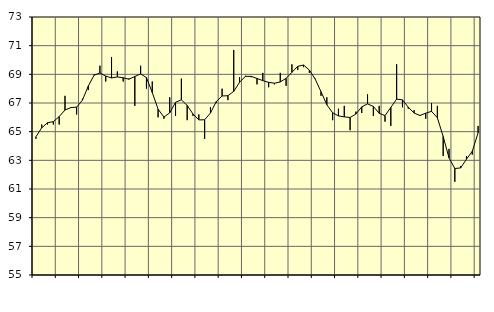
| Category | Piggar | Series 1 |
|---|---|---|
| nan | 64.5 | 64.64 |
| 1.0 | 65.5 | 65.27 |
| 1.0 | 65.5 | 65.62 |
| 1.0 | 65.5 | 65.7 |
| nan | 65.5 | 66.05 |
| 2.0 | 67.5 | 66.51 |
| 2.0 | 66.7 | 66.68 |
| 2.0 | 66.2 | 66.71 |
| nan | 67.3 | 67.2 |
| 3.0 | 67.9 | 68.18 |
| 3.0 | 69 | 68.94 |
| 3.0 | 69.6 | 69.09 |
| nan | 68.5 | 68.88 |
| 4.0 | 70.2 | 68.75 |
| 4.0 | 69.2 | 68.82 |
| 4.0 | 68.5 | 68.76 |
| nan | 68.7 | 68.66 |
| 5.0 | 66.8 | 68.85 |
| 5.0 | 69.6 | 69.03 |
| 5.0 | 68 | 68.77 |
| nan | 68.5 | 67.73 |
| 6.0 | 66 | 66.57 |
| 6.0 | 65.9 | 66.02 |
| 6.0 | 67.4 | 66.31 |
| nan | 66.1 | 67.05 |
| 7.0 | 68.7 | 67.22 |
| 7.0 | 65.8 | 66.83 |
| 7.0 | 66.1 | 66.23 |
| nan | 66.2 | 65.82 |
| 8.0 | 64.5 | 65.83 |
| 8.0 | 66.7 | 66.3 |
| 8.0 | 67 | 67.1 |
| nan | 68 | 67.49 |
| 9.0 | 67.2 | 67.51 |
| 9.0 | 70.7 | 67.81 |
| 9.0 | 68.8 | 68.44 |
| nan | 68.9 | 68.86 |
| 10.0 | 68.8 | 68.86 |
| 10.0 | 68.3 | 68.71 |
| 10.0 | 69.1 | 68.56 |
| nan | 68.1 | 68.44 |
| 11.0 | 68.3 | 68.38 |
| 11.0 | 69.1 | 68.47 |
| 11.0 | 68.2 | 68.72 |
| nan | 69.7 | 69.14 |
| 12.0 | 69.3 | 69.56 |
| 12.0 | 69.5 | 69.65 |
| 12.0 | 69.1 | 69.3 |
| nan | 68.7 | 68.67 |
| 13.0 | 67.5 | 67.79 |
| 13.0 | 67.4 | 66.88 |
| 13.0 | 65.8 | 66.32 |
| nan | 66.6 | 66.1 |
| 14.0 | 66.8 | 66.03 |
| 14.0 | 65.1 | 65.99 |
| 14.0 | 66.4 | 66.23 |
| nan | 66.3 | 66.73 |
| 15.0 | 67.6 | 66.94 |
| 15.0 | 66.1 | 66.76 |
| 15.0 | 66.8 | 66.28 |
| nan | 65.7 | 66.12 |
| 16.0 | 65.4 | 66.69 |
| 16.0 | 69.7 | 67.27 |
| 16.0 | 66.7 | 67.22 |
| nan | 66.6 | 66.71 |
| 17.0 | 66.5 | 66.3 |
| 17.0 | 66.1 | 66.13 |
| 17.0 | 65.9 | 66.29 |
| nan | 67 | 66.42 |
| 18.0 | 66.8 | 65.97 |
| 18.0 | 63.3 | 64.66 |
| 18.0 | 63.8 | 63.17 |
| nan | 61.5 | 62.43 |
| 19.0 | 62.6 | 62.47 |
| 19.0 | 63.3 | 63.08 |
| 19.0 | 63.4 | 63.63 |
| nan | 65.4 | 64.92 |